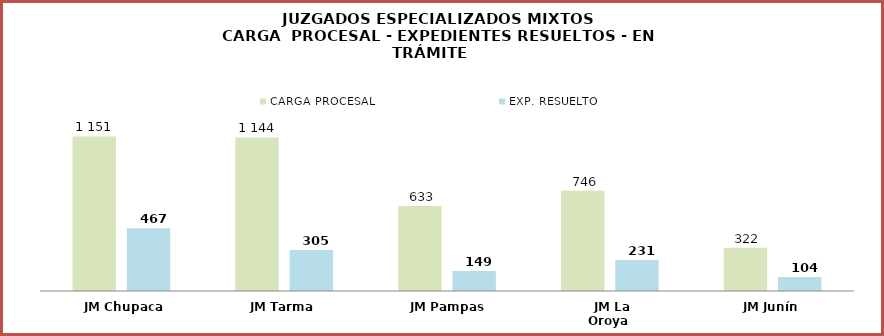
| Category | CARGA PROCESAL | EXP. RESUELTO |
|---|---|---|
| JM Chupaca | 1151 | 467 |
| JM Tarma | 1144 | 305 |
| JM Pampas | 633 | 149 |
| JM La Oroya | 746 | 231 |
| JM Junín | 322 | 104 |